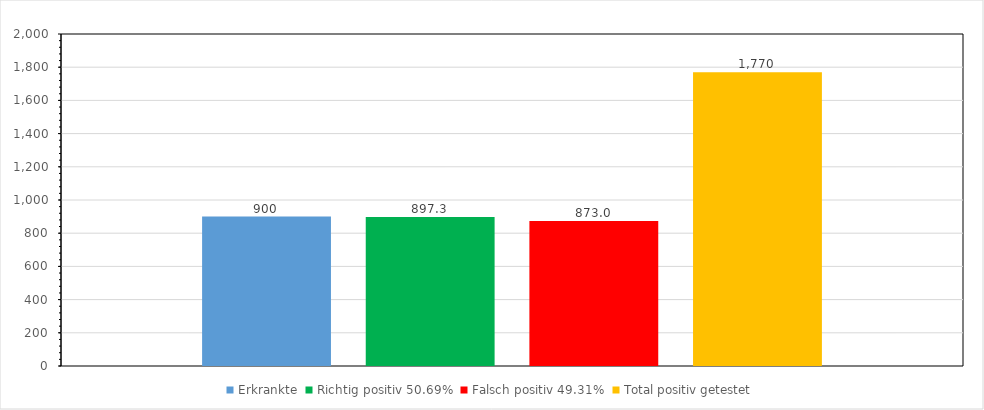
| Category | Erkrankte | Richtig positiv 50.69% | Falsch positiv 49.31% | Total positiv getestet |
|---|---|---|---|---|
| 0 | 900 | 897.3 | 873 | 1770.3 |